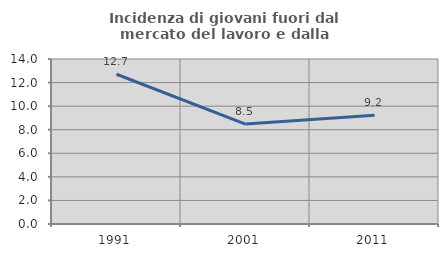
| Category | Incidenza di giovani fuori dal mercato del lavoro e dalla formazione  |
|---|---|
| 1991.0 | 12.705 |
| 2001.0 | 8.48 |
| 2011.0 | 9.225 |